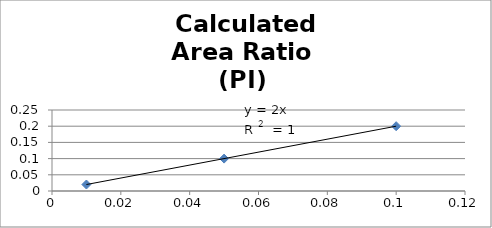
| Category | Calculated
Area Ratio 
(PI)  |
|---|---|
| 0.01 | 0.02 |
| 0.05 | 0.1 |
| 0.1 | 0.2 |